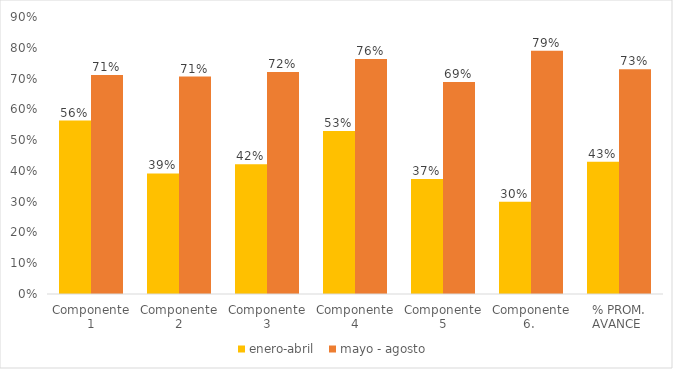
| Category | enero-abril  | mayo - agosto  | septiembre-diciembre |
|---|---|---|---|
| Componente 1 | 0.563 | 0.712 |  |
| Componente 2 | 0.392 | 0.707 |  |
| Componente 3 | 0.421 | 0.721 |  |
| Componente 4 | 0.53 | 0.763 |  |
| Componente 5 | 0.373 | 0.688 |  |
| Componente 6.  | 0.3 | 0.79 |  |
| % PROM. AVANCE  | 0.43 | 0.73 |  |